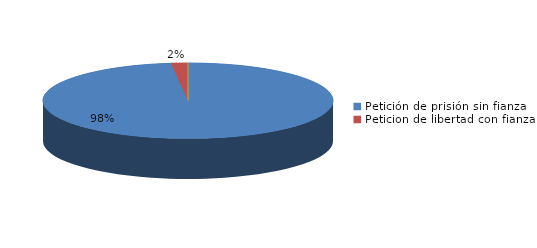
| Category | Series 0 |
|---|---|
| Petición de prisión sin fianza | 262 |
| Peticion de libertad con fianza | 5 |
| Petición de libertad | 0 |